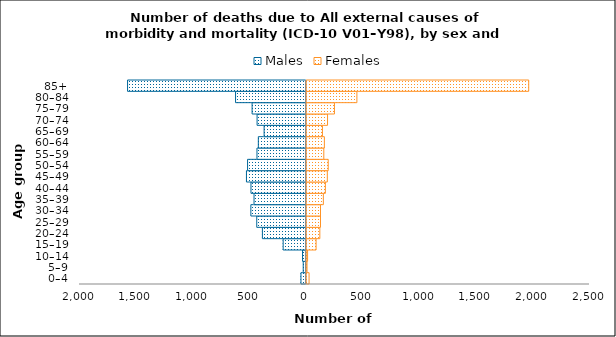
| Category | Males | Females |
|---|---|---|
| 0–4 | -46 | 30 |
| 5–9 | -26 | 12 |
| 10–14 | -32 | 17 |
| 15–19 | -203 | 92 |
| 20–24 | -386 | 125 |
| 25–29 | -436 | 131 |
| 30–34 | -488 | 131 |
| 35–39 | -460 | 156 |
| 40–44 | -487 | 174 |
| 45–49 | -527 | 191 |
| 50–54 | -517 | 199 |
| 55–59 | -434 | 160 |
| 60–64 | -422 | 165 |
| 65–69 | -371 | 148 |
| 70–74 | -433 | 193 |
| 75–79 | -477 | 254 |
| 80–84 | -623 | 452 |
| 85+ | -1576 | 1968 |